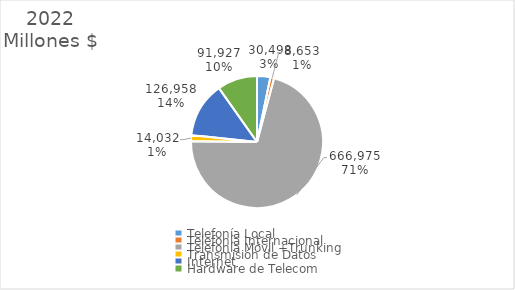
| Category | 2022 |
|---|---|
| Telefonía Local | 30498 |
| Telefonía Internacional  | 8653 |
| Telefonía Móvil +Trunking | 666975 |
| Transmisión de Datos | 14032 |
| Internet  | 126958 |
| Hardware de Telecom | 91927 |